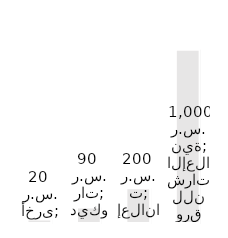
| Category | المصروفات السنوية |
|---|---|
| ورق للنشرات الإعلانية | 1000 |
| إعلانات | 200 |
| ديكورات | 90 |
| أخرى | 20 |